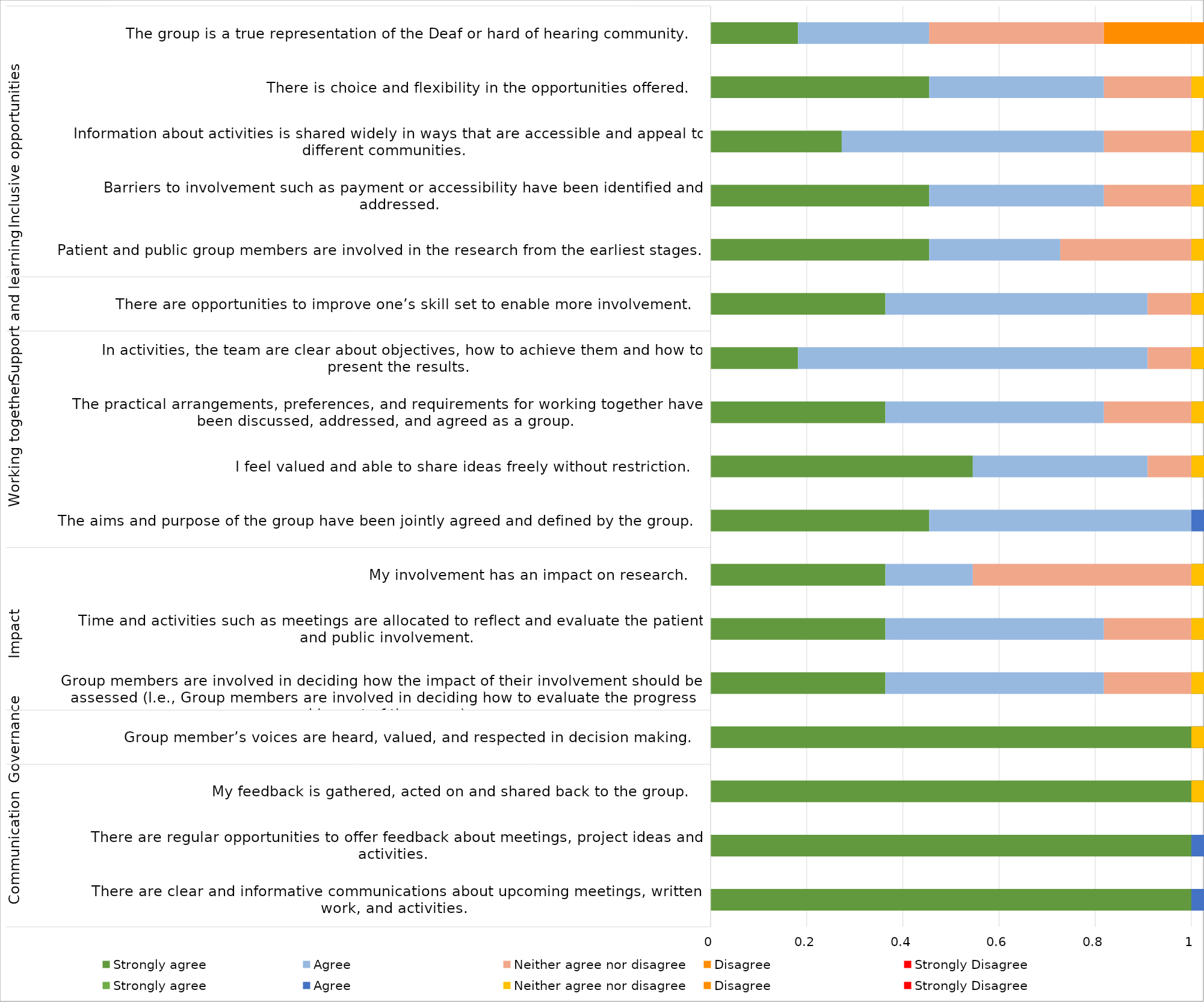
| Category | Strongly agree
 | Agree
 | Neither agree nor disagree
 | Disagree
 | Strongly Disagree 
 |
|---|---|---|---|---|---|
| There are clear and informative communications about upcoming meetings, written work, and activities. 

 | 6 | 5 | 0 | 0 | 0 |
| There are regular opportunities to offer feedback about meetings, project ideas and activities. 
 | 5 | 6 | 0 | 0 | 0 |
| My feedback is gathered, acted on and shared back to the group. 
 | 4 | 5 | 2 | 0 | 0 |
| Group member’s voices are heard, valued, and respected in decision making. 
 | 4 | 6 | 1 | 0 | 0 |
| 
Group members are involved in deciding how the impact of their involvement should be assessed (I.e., Group members are involved in deciding how to evaluate the progress and impact of the group). 
 | 0.364 | 0.455 | 0.182 | 0 | 0 |
| Time and activities such as meetings are allocated to reflect and evaluate the patient and public involvement. 
 | 0.364 | 0.455 | 0.182 | 0 | 0 |
| My involvement has an impact on research. 
 | 0.364 | 0.182 | 0.455 | 0 | 0 |
| The aims and purpose of the group have been jointly agreed and defined by the group. 
 | 0.455 | 0.545 | 0 | 0 | 0 |
| I feel valued and able to share ideas freely without restriction. 
 | 0.545 | 0.364 | 0.091 | 0 | 0 |
| The practical arrangements, preferences, and requirements for working together have been discussed, addressed, and agreed as a group. 
 | 0.364 | 0.455 | 0.182 | 0 | 0 |
| In activities, the team are clear about objectives, how to achieve them and how to present the results. 
 | 0.182 | 0.727 | 0.091 | 0 | 0 |
| There are opportunities to improve one’s skill set to enable more involvement. 
 | 0.364 | 0.545 | 0.091 | 0 | 0 |
| Patient and public group members are involved in the research from the earliest stages. 
 | 0.455 | 0.273 | 0.273 | 0 | 0 |
| Barriers to involvement such as payment or accessibility have been identified and addressed. 
 | 0.455 | 0.364 | 0.182 | 0 | 0 |
| Information about activities is shared widely in ways that are accessible and appeal to different communities. 
 | 0.273 | 0.545 | 0.182 | 0 | 0 |
| There is choice and flexibility in the opportunities offered. 
 | 0.455 | 0.364 | 0.182 | 0 | 0 |
| The group is a true representation of the Deaf or hard of hearing community. 
 | 0.182 | 0.273 | 0.364 | 0.182 | 0 |